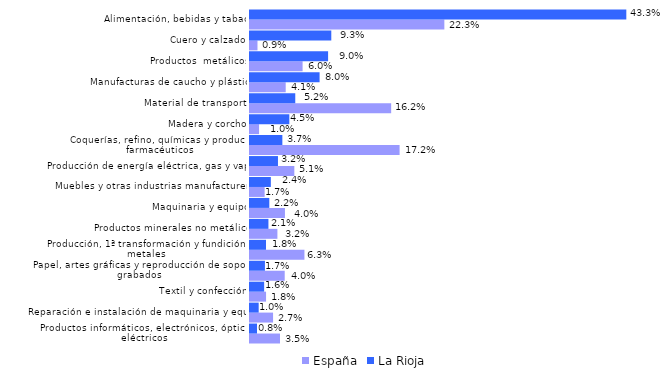
| Category | España | La Rioja |
|---|---|---|
| Productos informáticos, electrónicos, ópticos y eléctricos | 0.035 | 0.008 |
| Reparación e instalación de maquinaria y equipo | 0.027 | 0.01 |
| Textil y confección | 0.018 | 0.016 |
| Papel, artes gráficas y reproducción de soportes grabados | 0.04 | 0.017 |
| Producción, 1ª transformación y fundición de metales | 0.063 | 0.018 |
| Productos minerales no metálicos | 0.032 | 0.021 |
| Maquinaria y equipo | 0.04 | 0.022 |
| Muebles y otras industrias manufactureras | 0.017 | 0.024 |
| Producción de energía eléctrica, gas y vapor | 0.051 | 0.032 |
| Coquerías, refino, químicas y productos farmacéuticos | 0.172 | 0.037 |
| Madera y corcho | 0.01 | 0.045 |
| Material de transporte | 0.162 | 0.052 |
| Manufacturas de caucho y plástico | 0.041 | 0.08 |
| Productos  metálicos | 0.06 | 0.09 |
| Cuero y calzado | 0.009 | 0.093 |
| Alimentación, bebidas y tabaco | 0.223 | 0.433 |